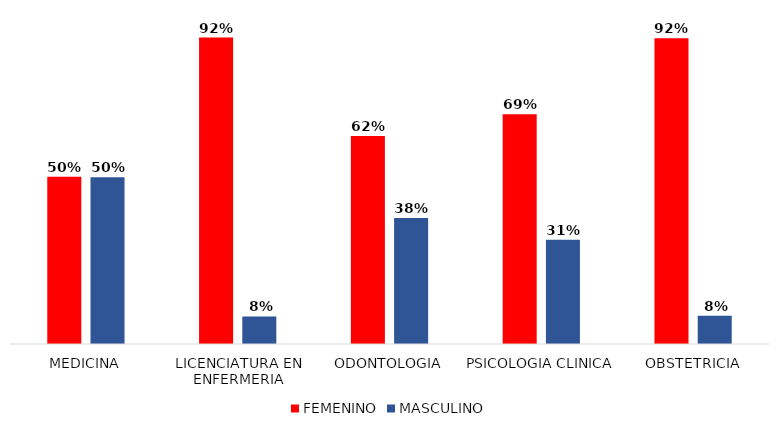
| Category | FEMENINO | MASCULINO |
|---|---|---|
| MEDICINA | 0.501 | 0.499 |
| LICENCIATURA EN ENFERMERIA | 0.918 | 0.082 |
| ODONTOLOGIA | 0.623 | 0.377 |
| PSICOLOGIA CLINICA | 0.688 | 0.312 |
| OBSTETRICIA | 0.915 | 0.085 |